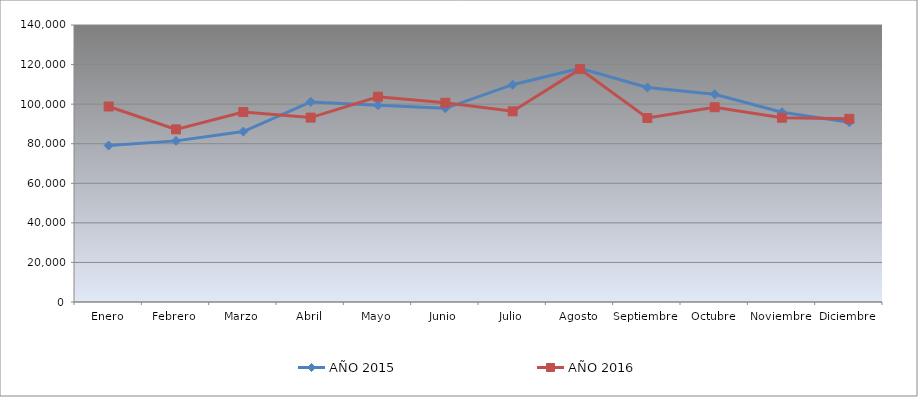
| Category | AÑO 2015 | AÑO 2016 |
|---|---|---|
| Enero | 79074.796 | 98804.944 |
| Febrero | 81434.404 | 87242.301 |
| Marzo | 86127.831 | 96002.784 |
| Abril | 101132.186 | 93200.623 |
| Mayo | 99481.75 | 103752.442 |
| Junio | 97900.082 | 100698.642 |
| Julio | 109831.359 | 96373.846 |
| Agosto | 118152.307 | 117690.738 |
| Septiembre | 108387.227 | 92987.369 |
| Octubre | 104991.799 | 98429.617 |
| Noviembre | 95922.997 | 93132.382 |
| Diciembre | 90825.557 | 92577.921 |